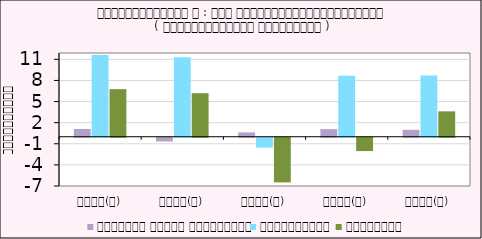
| Category | កសិកម្ម នេសាទ និងព្រៃឈើ | ឧស្សាហកម្ម | សេវាកម្ម |
|---|---|---|---|
| ២០១៨(ក) | 1.098 | 11.605 | 6.76 |
| ២០១៩(ក) | -0.532 | 11.283 | 6.185 |
| ២០២០(ព) | 0.619 | -1.402 | -6.343 |
| ២០២១(ប) | 1.079 | 8.673 | -1.897 |
| ២០២២(ប) | 0.979 | 8.697 | 3.608 |